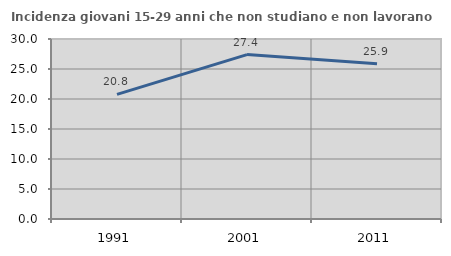
| Category | Incidenza giovani 15-29 anni che non studiano e non lavorano  |
|---|---|
| 1991.0 | 20.761 |
| 2001.0 | 27.397 |
| 2011.0 | 25.862 |